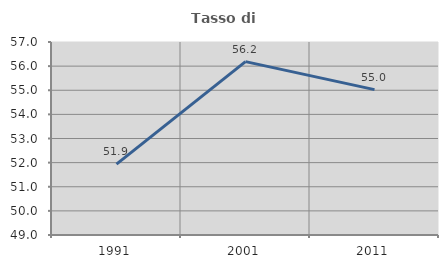
| Category | Tasso di occupazione   |
|---|---|
| 1991.0 | 51.94 |
| 2001.0 | 56.188 |
| 2011.0 | 55.026 |